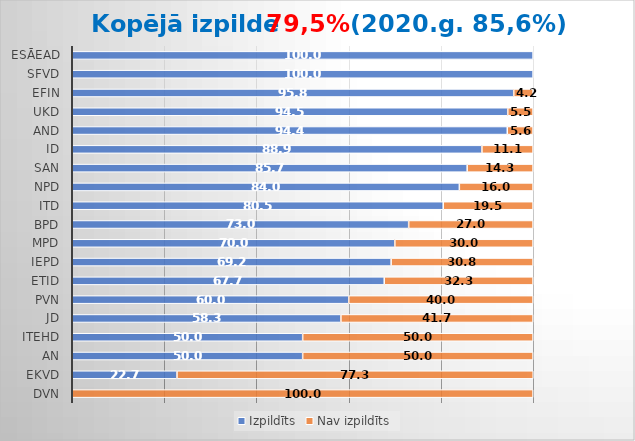
| Category | Izpildīts | Nav izpildīts |
|---|---|---|
| DVN | 0 | 100 |
| EKVD | 22.73 | 77.3 |
| AN | 50 | 50 |
| ITEHD | 50 | 50 |
| JD | 58.3 | 41.7 |
| PVN | 60 | 40 |
| ETID | 67.7 | 32.3 |
| IEPD | 69.2 | 30.8 |
| MPD | 70 | 30 |
| BPD | 73 | 27 |
| ITD | 80.5 | 19.5 |
| NPD | 84 | 16 |
| SAN | 85.7 | 14.3 |
| ID | 88.9 | 11.1 |
| AND | 94.4 | 5.6 |
| UKD | 94.5 | 5.5 |
| EFIN | 95.8 | 4.2 |
| SFVD | 100 | 0 |
| ESĀEAD | 100 | 0 |